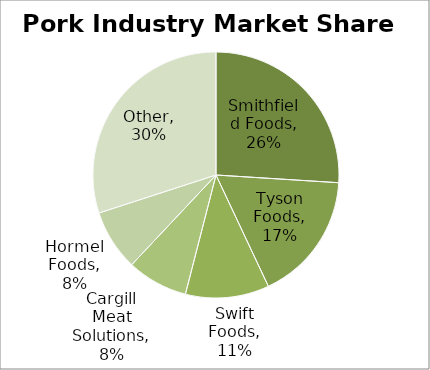
| Category | 26% 17% 11% 8% 8% 30% |
|---|---|
| Smithfield Foods | 0.26 |
| Tyson Foods | 0.17 |
| Swift Foods | 0.11 |
| Cargill Meat Solutions | 0.08 |
| Hormel Foods | 0.08 |
| Other | 0.3 |